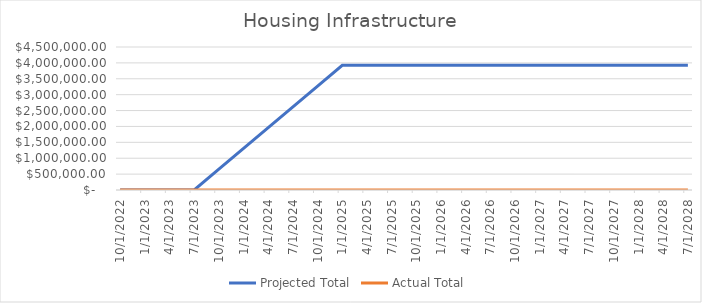
| Category | Projected Total | Actual Total  |
|---|---|---|
| 10/1/22 | 0 | 0 |
| 1/1/23 | 0 | 0 |
| 4/1/23 | 0 | 0 |
| 7/1/23 | 0 | 0 |
| 10/1/23 | 654086.5 | 0 |
| 1/1/24 | 1308173 | 0 |
| 4/1/24 | 1962259.5 | 0 |
| 7/1/24 | 2616346 | 0 |
| 10/1/24 | 3270432.5 | 0 |
| 1/1/25 | 3924519 | 0 |
| 4/1/25 | 3924519 | 0 |
| 7/1/25 | 3924519 | 0 |
| 10/1/25 | 3924519 | 0 |
| 1/1/26 | 3924519 | 0 |
| 4/1/26 | 3924519 | 0 |
| 7/1/26 | 3924519 | 0 |
| 10/1/26 | 3924519 | 0 |
| 1/1/27 | 3924519 | 0 |
| 4/1/27 | 3924519 | 0 |
| 7/1/27 | 3924519 | 0 |
| 10/1/27 | 3924519 | 0 |
| 1/1/28 | 3924519 | 0 |
| 4/1/28 | 3924519 | 0 |
| 7/1/28 | 3924519 | 0 |